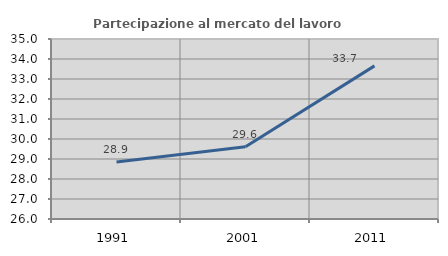
| Category | Partecipazione al mercato del lavoro  femminile |
|---|---|
| 1991.0 | 28.855 |
| 2001.0 | 29.611 |
| 2011.0 | 33.656 |